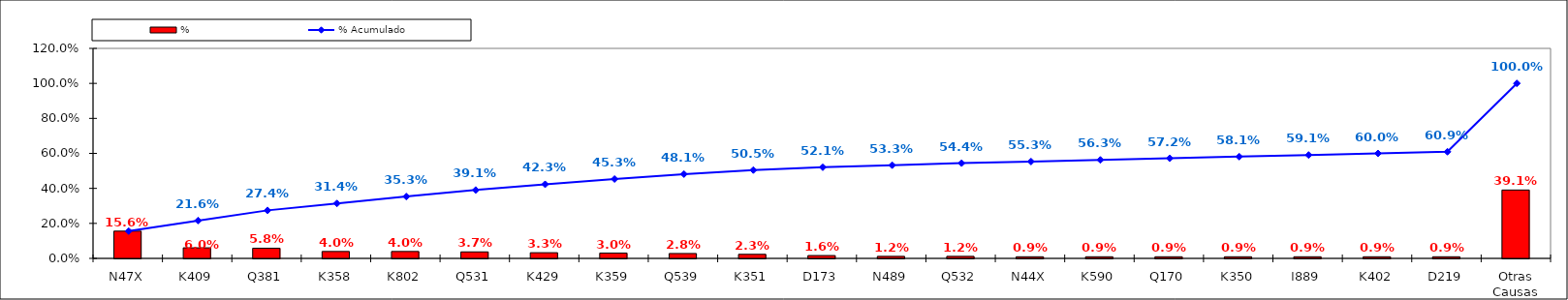
| Category | % |
|---|---|
| N47X | 0.156 |
| K409 | 0.06 |
| Q381 | 0.058 |
| K358 | 0.04 |
| K802 | 0.04 |
| Q531 | 0.037 |
| K429 | 0.033 |
| K359 | 0.03 |
| Q539 | 0.028 |
| K351 | 0.023 |
| D173 | 0.016 |
| N489 | 0.012 |
| Q532 | 0.012 |
| N44X | 0.009 |
| K590 | 0.009 |
| Q170 | 0.009 |
| K350 | 0.009 |
| I889 | 0.009 |
| K402 | 0.009 |
| D219 | 0.009 |
| Otras Causas | 0.391 |